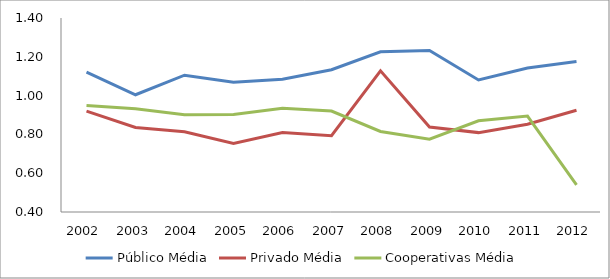
| Category | Público Média | Privado Média | Cooperativas Média |
|---|---|---|---|
| 2002.0 | 1.121 | 0.92 | 0.949 |
| 2003.0 | 1.004 | 0.836 | 0.932 |
| 2004.0 | 1.105 | 0.814 | 0.902 |
| 2005.0 | 1.069 | 0.753 | 0.903 |
| 2006.0 | 1.084 | 0.81 | 0.935 |
| 2007.0 | 1.134 | 0.794 | 0.92 |
| 2008.0 | 1.226 | 1.128 | 0.815 |
| 2009.0 | 1.233 | 0.838 | 0.775 |
| 2010.0 | 1.08 | 0.809 | 0.87 |
| 2011.0 | 1.143 | 0.852 | 0.894 |
| 2012.0 | 1.175 | 0.925 | 0.54 |